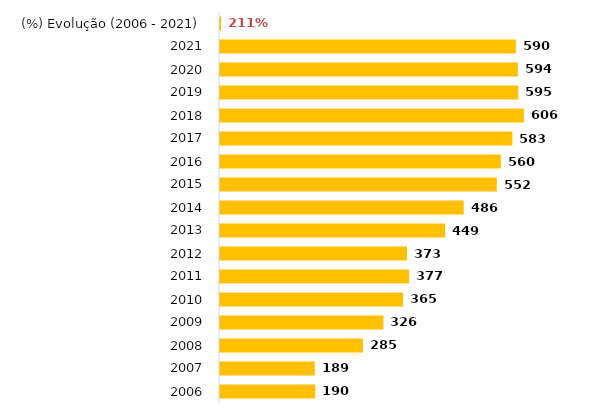
| Category | Total Geral |
|---|---|
| 2006 | 190 |
| 2007 | 189 |
| 2008 | 285 |
| 2009 | 326 |
| 2010 | 365 |
| 2011 | 377 |
| 2012 | 373 |
| 2013 | 449 |
| 2014 | 486 |
| 2015 | 552 |
| 2016 | 560 |
| 2017 | 583 |
| 2018 | 606 |
| 2019 | 595 |
| 2020 | 594 |
| 2021 | 590 |
| (%) Evolução (2006 - 2021) | 2.105 |